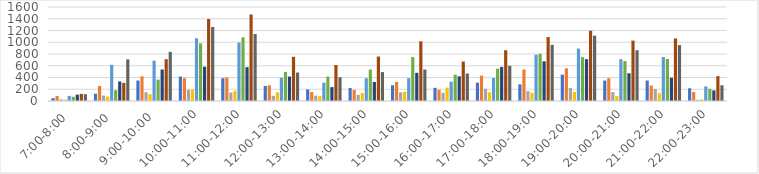
| Category | Series 0 | Series 1 | Series 2 | Series 3 | Series 4 | Series 5 | Series 6 | Series 7 | Series 8 |
|---|---|---|---|---|---|---|---|---|---|
| 7:00-8:00 | 48 | 84 | 28 | 24 | 88 | 72 | 108 | 120 | 116 |
| 8:00-9:00 | 124 | 256 | 92 | 76 | 616 | 184 | 332 | 308 | 708 |
| 9:00-10:00 | 348 | 420 | 148 | 116 | 688 | 364 | 536 | 712 | 836 |
| 10:00-11:00 | 416 | 388 | 192 | 196 | 1068 | 980 | 584 | 1396 | 1260 |
| 11:00-12:00 | 388 | 400 | 144 | 176 | 996 | 1084 | 576 | 1472 | 1140 |
| 12:00-13:00 | 256 | 268 | 88 | 148 | 396 | 496 | 416 | 752 | 484 |
| 13:00-14:00 | 196 | 152 | 92 | 84 | 312 | 416 | 236 | 612 | 404 |
| 14:00-15:00 | 220 | 188 | 104 | 136 | 388 | 536 | 324 | 756 | 492 |
| 15:00-16:00 | 268 | 324 | 148 | 156 | 388 | 748 | 480 | 1016 | 536 |
| 16:00-17:00 | 224 | 192 | 140 | 228 | 328 | 448 | 420 | 672 | 468 |
| 17:00-18:00 | 312 | 432 | 208 | 148 | 392 | 552 | 580 | 864 | 600 |
| 18:00-19:00 | 284 | 536 | 168 | 140 | 788 | 804 | 676 | 1088 | 956 |
| 19:00-20:00 | 448 | 556 | 220 | 156 | 892 | 748 | 712 | 1196 | 1112 |
| 20:00-21:00 | 348 | 388 | 152 | 84 | 712 | 680 | 472 | 1028 | 864 |
| 21:00-22:00 | 348 | 264 | 204 | 132 | 748 | 716 | 396 | 1064 | 952 |
| 22:00-23:00 | 216 | 152 | 20 | 28 | 248 | 208 | 180 | 424 | 268 |